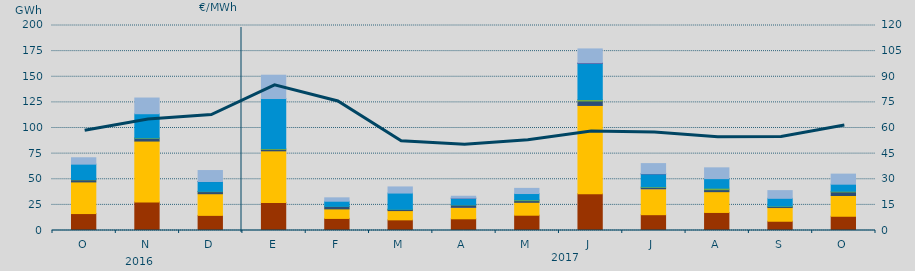
| Category | Carbón | Ciclo Combinado | Cogeneración | Consumo Bombeo | Eólica | Hidráulica | Nuclear | Turbinación bombeo |
|---|---|---|---|---|---|---|---|---|
| O | 16527.1 | 30870.5 | 0 | 2014.8 | 341.7 | 14982.5 | 0 | 6233.4 |
| N | 27911.6 | 59353 | 0 | 2603.5 | 562.8 | 23494.9 | 0 | 15319.9 |
| D | 14759.8 | 21112.2 | 0 | 2054.9 | 290 | 9517.7 | 60 | 10705.2 |
| E | 27333.2 | 50390.4 | 0 | 1420.1 | 796.7 | 48799.7 | 0 | 22768.5 |
| F | 11782.3 | 9297.4 | 0 | 2429.3 | 37.7 | 5011.6 | 0 | 3301.6 |
| M | 10392.3 | 9024.8 | 0 | 1213 | 83.9 | 15815.6 | 0 | 5970.4 |
| A | 11417.3 | 11177.4 | 1 | 2298.7 | 146.3 | 6448.1 | 105 | 1824.9 |
| M | 14921.9 | 12578.5 | 0 | 1623.5 | 791 | 6148.7 | 0 | 5041.6 |
| J | 35897.1 | 86103.9 | 16 | 4321.9 | 1499 | 35181.7 | 537 | 13587.3 |
| J | 15424.3 | 25298.7 | 6 | 1196.5 | 694.8 | 12560.8 | 231 | 9853.3 |
| A | 17604.1 | 20278.5 | 0 | 1953.7 | 1479 | 9282.6 | 0 | 10537.6 |
| S | 9030.9 | 13355.9 | 0 | 972.7 | 456.9 | 7586.6 | 0 | 7497.3 |
| O | 13899.2 | 20227.3 | 0 | 3473.9 | 731.2 | 6859.3 | 0 | 9809.3 |